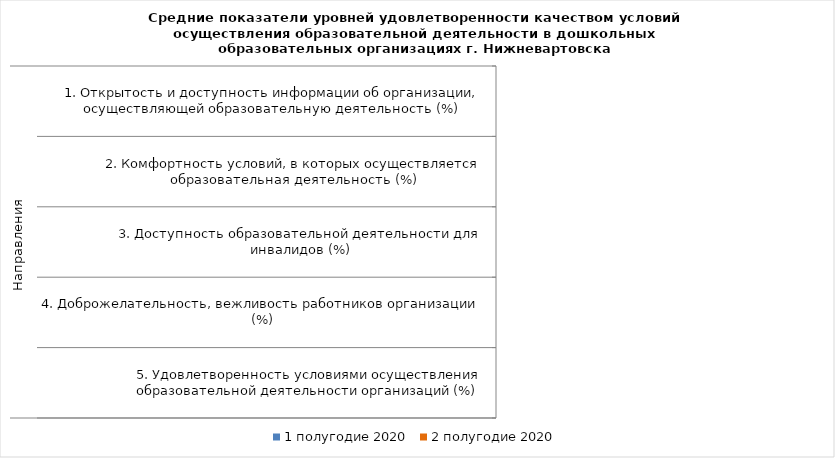
| Category | 1 полугодие 2020 | 2 полугодие 2020 |
|---|---|---|
| 0 | 0 | 0 |
| 1 | 0 | 0 |
| 2 | 0 | 0 |
| 3 | 0 | 0 |
| 4 | 0 | 0 |